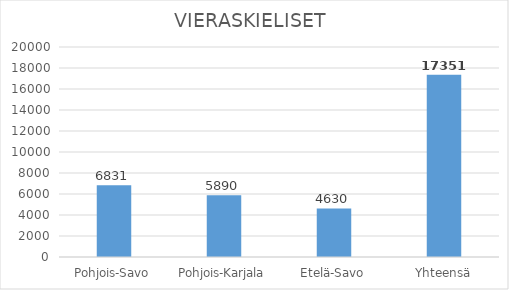
| Category | VIERASKIELISET  |
|---|---|
| Pohjois-Savo | 6831 |
| Pohjois-Karjala | 5890 |
| Etelä-Savo | 4630 |
| Yhteensä | 17351 |